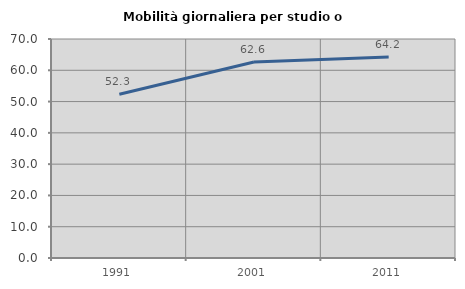
| Category | Mobilità giornaliera per studio o lavoro |
|---|---|
| 1991.0 | 52.336 |
| 2001.0 | 62.644 |
| 2011.0 | 64.235 |